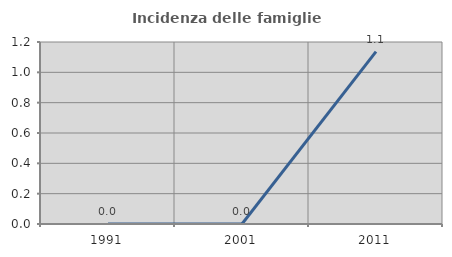
| Category | Incidenza delle famiglie numerose |
|---|---|
| 1991.0 | 0 |
| 2001.0 | 0 |
| 2011.0 | 1.136 |